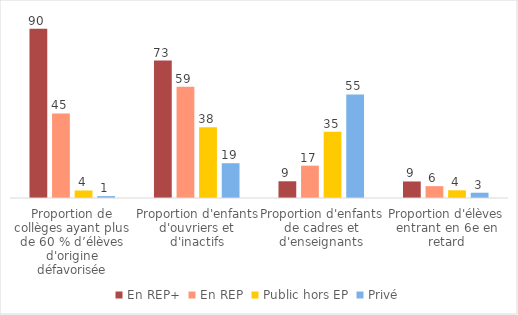
| Category | En REP+ | En REP | Public hors EP | Privé |
|---|---|---|---|---|
| Proportion de collèges ayant plus de 60 % d’élèves d'origine défavorisée | 90 | 45 | 4 | 1 |
| Proportion d'enfants d'ouvriers et d'inactifs | 73.1 | 59.2 | 37.6 | 18.5 |
| Proportion d'enfants de cadres et d'enseignants | 8.9 | 17.2 | 35.3 | 55.1 |
| Proportion d'élèves entrant en 6e en retard | 8.8 | 6.3 | 4.1 | 2.8 |